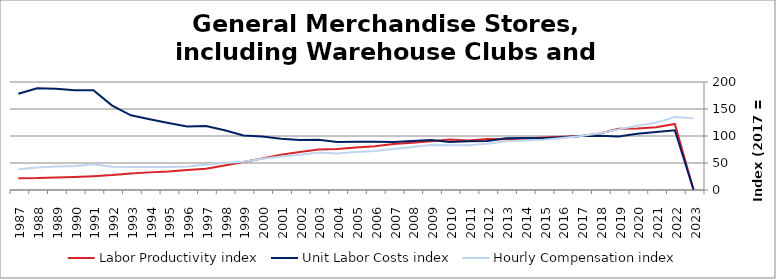
| Category | Labor Productivity index | Unit Labor Costs index | Hourly Compensation index |
|---|---|---|---|
| 2023.0 | 0 | 0 | 132.639 |
| 2022.0 | 122.37 | 110.58 | 135.317 |
| 2021.0 | 116.128 | 107.414 | 124.738 |
| 2020.0 | 114.033 | 104.191 | 118.813 |
| 2019.0 | 113.476 | 98.956 | 112.291 |
| 2018.0 | 104.798 | 100.306 | 105.119 |
| 2017.0 | 100 | 100 | 100 |
| 2016.0 | 98.546 | 97.829 | 96.407 |
| 2015.0 | 97.243 | 95.737 | 93.097 |
| 2014.0 | 95.39 | 96.333 | 91.892 |
| 2013.0 | 94.027 | 95.898 | 90.17 |
| 2012.0 | 94.346 | 90.57 | 85.449 |
| 2011.0 | 91.823 | 90.07 | 82.705 |
| 2010.0 | 93.368 | 88.929 | 83.032 |
| 2009.0 | 90.416 | 92.389 | 83.534 |
| 2008.0 | 87.456 | 90.915 | 79.51 |
| 2007.0 | 85.393 | 88.973 | 75.976 |
| 2006.0 | 81.021 | 89.148 | 72.229 |
| 2005.0 | 78.921 | 89.438 | 70.585 |
| 2004.0 | 75.952 | 88.979 | 67.581 |
| 2003.0 | 74.904 | 92.959 | 69.63 |
| 2002.0 | 70.506 | 92.419 | 65.161 |
| 2001.0 | 65.415 | 95.034 | 62.166 |
| 2000.0 | 58.299 | 99.034 | 57.735 |
| 1999.0 | 51.74 | 100.828 | 52.168 |
| 1998.0 | 45.222 | 110.578 | 50.006 |
| 1997.0 | 39.431 | 118.554 | 46.748 |
| 1996.0 | 36.95 | 117.696 | 43.489 |
| 1995.0 | 34.31 | 123.983 | 42.539 |
| 1994.0 | 32.639 | 130.937 | 42.736 |
| 1993.0 | 30.698 | 138.388 | 42.483 |
| 1992.0 | 27.614 | 156.353 | 43.176 |
| 1991.0 | 25.689 | 184.927 | 47.506 |
| 1990.0 | 24.168 | 184.525 | 44.596 |
| 1989.0 | 23.296 | 187.352 | 43.645 |
| 1988.0 | 22.046 | 188.311 | 41.514 |
| 1987.0 | 21.636 | 178.109 | 38.535 |